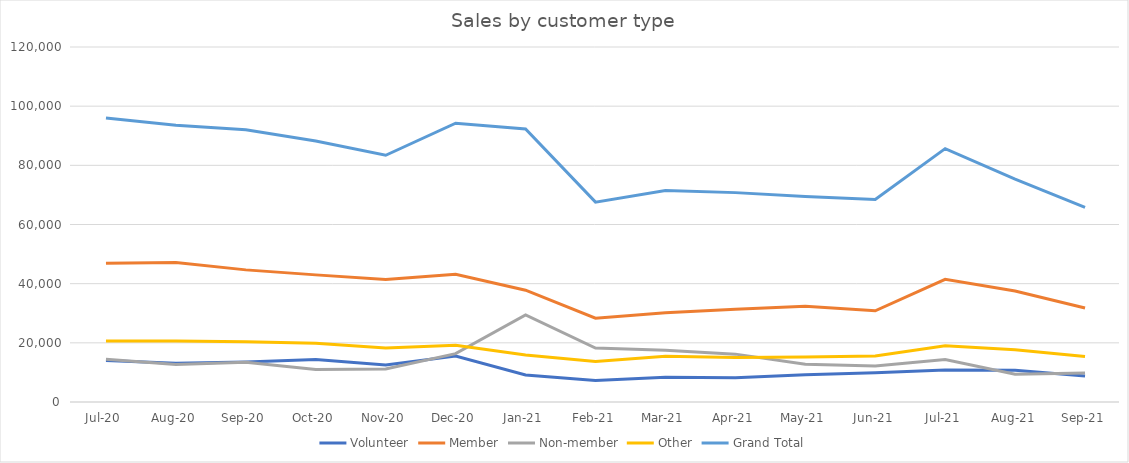
| Category | Volunteer | Member | Non-member | Other | Grand Total |
|---|---|---|---|---|---|
| Jul-20 | 13994.42 | 46941.85 | 14446.83 | 20606.32 | 95989.42 |
| Aug-20 | 13085.45 | 47168.7 | 12701.88 | 20583.76 | 93539.79 |
| Sep-20 | 13547.25 | 44661.68 | 13443.25 | 20404.09 | 92056.27 |
| Oct-20 | 14397.59 | 42971.55 | 10949.24 | 19896.86 | 88215.24 |
| Nov-20 | 12514 | 41449.65 | 11163.69 | 18273.55 | 83400.89 |
| Dec-20 | 15528.52 | 43177.85 | 16345.14 | 19172.95 | 94224.46 |
| Jan-21 | 9144.31 | 37783.29 | 29471.42 | 15885.44 | 92284.46 |
| Feb-21 | 7244.12 | 28348.73 | 18244.12 | 13727.86 | 67564.83 |
| Mar-21 | 8398.61 | 30188.87 | 17469.28 | 15438.95 | 71495.71 |
| Apr-21 | 8185.75 | 31328.67 | 16181.87 | 15078.56 | 70774.85 |
| May-21 | 9183.66 | 32341.01 | 12735.73 | 15183.75 | 69444.15 |
| Jun-21 | 9892.04 | 30825.31 | 12206.03 | 15568.94 | 68492.32 |
| Jul-21 | 10833.52 | 41464.17 | 14371.88 | 18975.84 | 85645.41 |
| Aug-21 | 10754.59 | 37512.39 | 9379.67 | 17665.99 | 75312.64 |
| Sep-21 | 8805.27 | 31751.69 | 9840.12 | 15386.82 | 65783.9 |